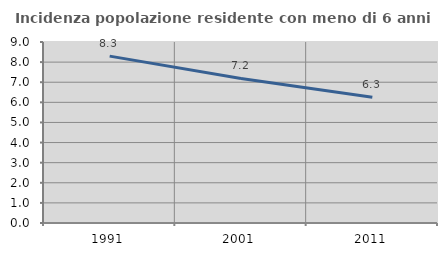
| Category | Incidenza popolazione residente con meno di 6 anni |
|---|---|
| 1991.0 | 8.297 |
| 2001.0 | 7.187 |
| 2011.0 | 6.254 |